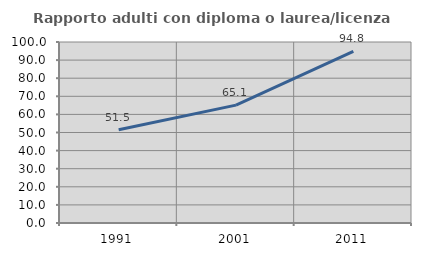
| Category | Rapporto adulti con diploma o laurea/licenza media  |
|---|---|
| 1991.0 | 51.502 |
| 2001.0 | 65.123 |
| 2011.0 | 94.848 |